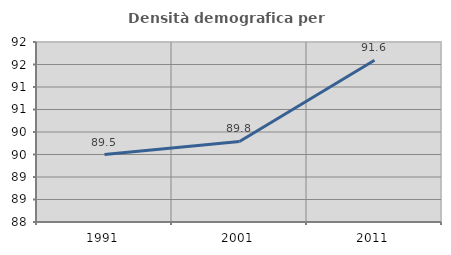
| Category | Densità demografica |
|---|---|
| 1991.0 | 89.499 |
| 2001.0 | 89.79 |
| 2011.0 | 91.595 |